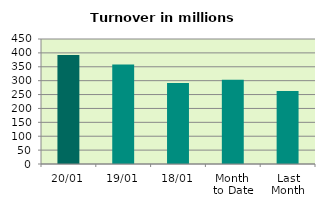
| Category | Series 0 |
|---|---|
| 20/01 | 391.985 |
| 19/01 | 358.534 |
| 18/01 | 291.55 |
| Month 
to Date | 303.51 |
| Last
Month | 263.133 |